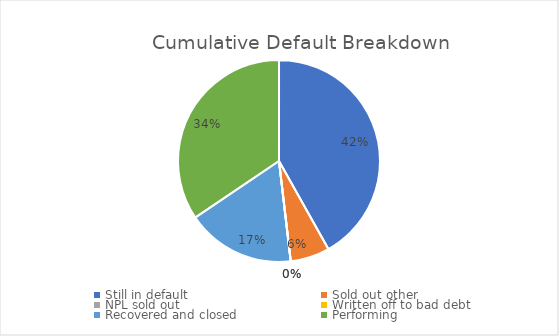
| Category | Cumulative Default Breakdown |
|---|---|
| Still in default | 0.419 |
| Sold out other | 0.063 |
| NPL sold out | 0 |
| Written off to bad debt | 0 |
| Recovered and closed | 0.174 |
| Performing | 0.345 |